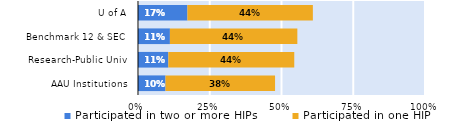
| Category | Participated in two or more HIPs | Participated in one HIP |
|---|---|---|
| AAU Institutions | 0.096 | 0.382 |
| Research-Public Univ | 0.106 | 0.439 |
| Benchmark 12 & SEC | 0.111 | 0.444 |
| U of A | 0.172 | 0.437 |